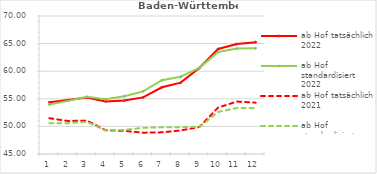
| Category | ab Hof tatsächlich 2022 | ab Hof standardisiert 2022 | ab Hof tatsächlich 2021 | ab Hof standardisiert 2021 |
|---|---|---|---|---|
| 0 | 54.361 | 53.955 | 51.481 | 50.561 |
| 1 | 54.783 | 54.624 | 50.977 | 50.59 |
| 2 | 55.23 | 55.358 | 51.054 | 50.833 |
| 3 | 54.526 | 54.899 | 49.303 | 49.253 |
| 4 | 54.676 | 55.464 | 49.197 | 49.373 |
| 5 | 55.261 | 56.343 | 48.863 | 49.736 |
| 6 | 57.085 | 58.359 | 48.923 | 49.845 |
| 7 | 57.925 | 59.007 | 49.273 | 49.86 |
| 8 | 60.595 | 60.619 | 49.894 | 49.924 |
| 9 | 64.03 | 63.496 | 53.406 | 52.623 |
| 10 | 64.925 | 64.096 | 54.506 | 53.332 |
| 11 | 65.263 | 64.154 | 54.298 | 53.359 |